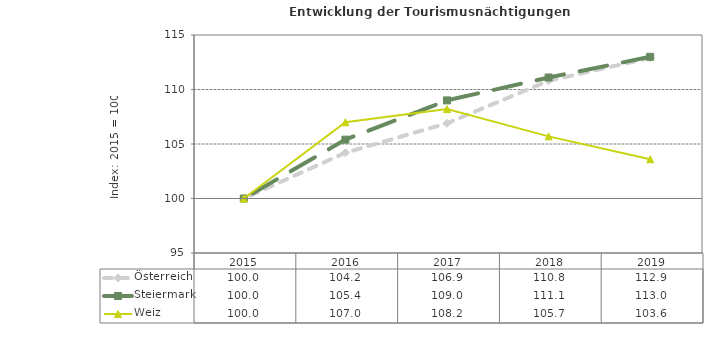
| Category | Österreich | Steiermark | Weiz |
|---|---|---|---|
| 2019.0 | 112.9 | 113 | 103.6 |
| 2018.0 | 110.8 | 111.1 | 105.7 |
| 2017.0 | 106.9 | 109 | 108.2 |
| 2016.0 | 104.2 | 105.4 | 107 |
| 2015.0 | 100 | 100 | 100 |